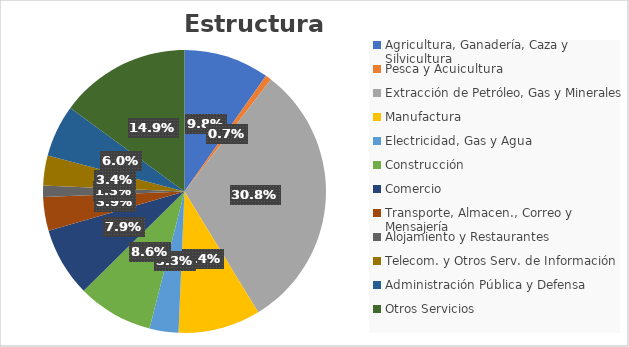
| Category | Series 0 |
|---|---|
| Agricultura, Ganadería, Caza y Silvicultura | 8170803 |
| Pesca y Acuicultura | 578990 |
| Extracción de Petróleo, Gas y Minerales | 25772997 |
| Manufactura | 7864003 |
| Electricidad, Gas y Agua | 2765994 |
| Construcción | 7225444 |
| Comercio | 6603943 |
| Transporte, Almacen., Correo y Mensajería | 3226739 |
| Alojamiento y Restaurantes | 1096077 |
| Telecom. y Otros Serv. de Información | 2849588 |
| Administración Pública y Defensa | 4993769 |
| Otros Servicios | 12494578 |